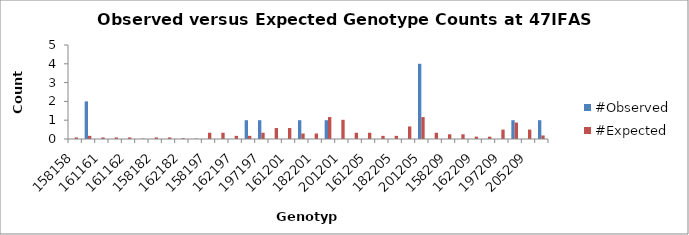
| Category | #Observed | #Expected |
|---|---|---|
| 158158.0 | 0 | 0.083 |
| 158161.0 | 2 | 0.167 |
| 161161.0 | 0 | 0.083 |
| 158162.0 | 0 | 0.083 |
| 161162.0 | 0 | 0.083 |
| 162162.0 | 0 | 0.021 |
| 158182.0 | 0 | 0.083 |
| 161182.0 | 0 | 0.083 |
| 162182.0 | 0 | 0.042 |
| 182182.0 | 0 | 0.021 |
| 158197.0 | 0 | 0.333 |
| 161197.0 | 0 | 0.333 |
| 162197.0 | 0 | 0.167 |
| 182197.0 | 1 | 0.167 |
| 197197.0 | 1 | 0.333 |
| 158201.0 | 0 | 0.583 |
| 161201.0 | 0 | 0.583 |
| 162201.0 | 1 | 0.292 |
| 182201.0 | 0 | 0.292 |
| 197201.0 | 1 | 1.167 |
| 201201.0 | 0 | 1.021 |
| 158205.0 | 0 | 0.333 |
| 161205.0 | 0 | 0.333 |
| 162205.0 | 0 | 0.167 |
| 182205.0 | 0 | 0.167 |
| 197205.0 | 0 | 0.667 |
| 201205.0 | 4 | 1.167 |
| 205205.0 | 0 | 0.333 |
| 158209.0 | 0 | 0.25 |
| 161209.0 | 0 | 0.25 |
| 162209.0 | 0 | 0.125 |
| 182209.0 | 0 | 0.125 |
| 197209.0 | 0 | 0.5 |
| 201209.0 | 1 | 0.875 |
| 205209.0 | 0 | 0.5 |
| 209209.0 | 1 | 0.188 |